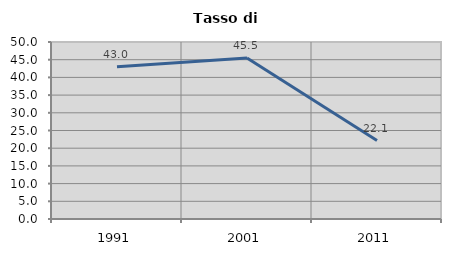
| Category | Tasso di disoccupazione   |
|---|---|
| 1991.0 | 43.034 |
| 2001.0 | 45.466 |
| 2011.0 | 22.147 |